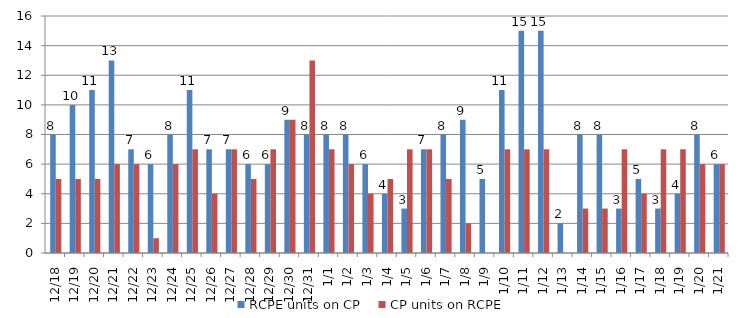
| Category | RCPE units on CP | CP units on RCPE |
|---|---|---|
| 2014-12-18 | 8 | 5 |
| 2014-12-19 | 10 | 5 |
| 2014-12-20 | 11 | 5 |
| 2014-12-21 | 13 | 6 |
| 2014-12-22 | 7 | 6 |
| 2014-12-23 | 6 | 1 |
| 2014-12-24 | 8 | 6 |
| 2014-12-25 | 11 | 7 |
| 2014-12-26 | 7 | 4 |
| 2014-12-27 | 7 | 7 |
| 2014-12-28 | 6 | 5 |
| 2014-12-29 | 6 | 7 |
| 2014-12-30 | 9 | 9 |
| 2014-12-31 | 8 | 13 |
| 2015-01-01 | 8 | 7 |
| 2015-01-02 | 8 | 6 |
| 2015-01-03 | 6 | 4 |
| 2015-01-04 | 4 | 5 |
| 2015-01-05 | 3 | 7 |
| 2015-01-06 | 7 | 7 |
| 2015-01-07 | 8 | 5 |
| 2015-01-08 | 9 | 2 |
| 2015-01-09 | 5 | 0 |
| 2015-01-10 | 11 | 7 |
| 2015-01-11 | 15 | 7 |
| 2015-01-12 | 15 | 7 |
| 2015-01-13 | 2 | 0 |
| 2015-01-14 | 8 | 3 |
| 2015-01-15 | 8 | 3 |
| 2015-01-16 | 3 | 7 |
| 2015-01-17 | 5 | 4 |
| 2015-01-18 | 3 | 7 |
| 2015-01-19 | 4 | 7 |
| 2015-01-20 | 8 | 6 |
| 2015-01-21 | 6 | 6 |